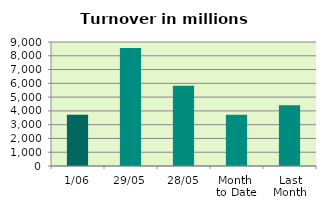
| Category | Series 0 |
|---|---|
| 1/06 | 3724.186 |
| 29/05 | 8563.869 |
| 28/05 | 5826.936 |
| Month 
to Date | 3724.186 |
| Last
Month | 4406.275 |